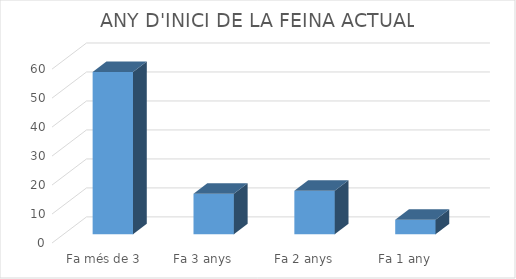
| Category | Series 0 |
|---|---|
| Fa més de 3 anys | 56 |
| Fa 3 anys | 14 |
| Fa 2 anys | 15 |
| Fa 1 any | 5 |